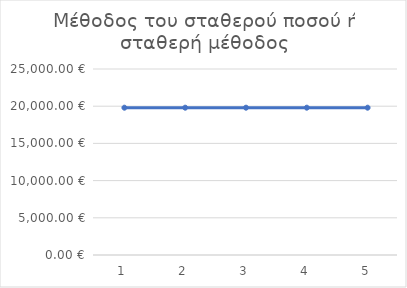
| Category | Μέθοδος του σταθερού ποσού ή σταθερή μέθοδος |
|---|---|
| 1.0 | 19800 |
| 2.0 | 19800 |
| 3.0 | 19800 |
| 4.0 | 19800 |
| 5.0 | 19800 |